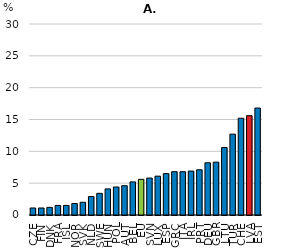
| Category | Males |
|---|---|
| CZE | 1.1 |
| FIN | 1.1 |
| DNK | 1.2 |
| FRA | 1.5 |
| ISL | 1.5 |
| NOR | 1.8 |
| SVK | 2 |
| NLD | 2.9 |
| SWE | 3.4 |
| HUN | 4.1 |
| POL | 4.4 |
| AUT | 4.6 |
| BEL | 5.2 |
| EU | 5.6 |
| SVN | 5.8 |
| LUX | 6.1 |
| ESP | 6.5 |
| GRC | 6.8 |
| ITA | 6.8 |
| IRL | 6.9 |
| PRT | 7.1 |
| DEU | 8.2 |
| GBR | 8.3 |
| LTU | 10.6 |
| TUR | 12.7 |
| CHE | 15.2 |
| LVA | 15.6 |
| EST | 16.8 |